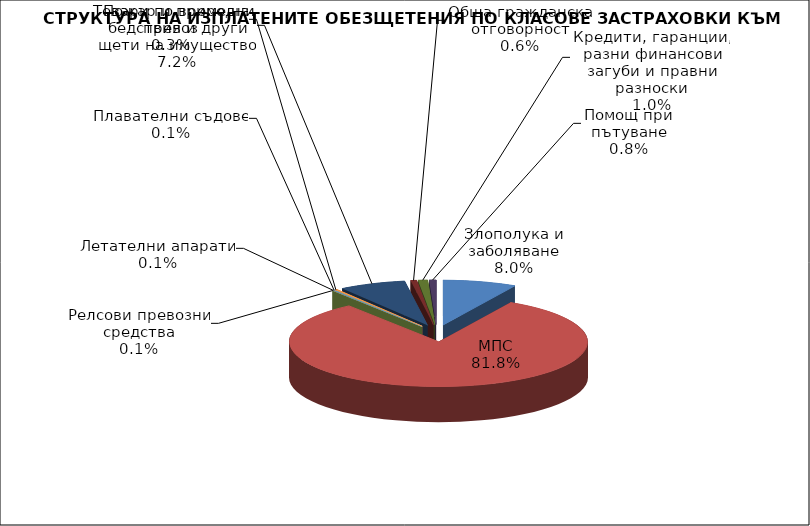
| Category | Злополука и заболяване |
|---|---|
| Злополука и заболяване | 0.08 |
| МПС | 0.818 |
| Релсови превозни средства | 0.001 |
| Летателни апарати | 0.001 |
| Плавателни съдове | 0.001 |
| Товари по време на превоз | 0.003 |
| Пожар и природни бедствия и други щети на имущество | 0.072 |
| Обща гражданска отговорност | 0.006 |
| Кредити, гаранции, разни финансови загуби и правни разноски | 0.01 |
| Помощ при пътуване | 0.008 |